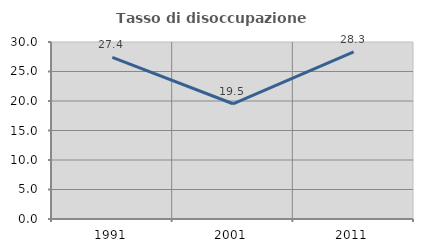
| Category | Tasso di disoccupazione giovanile  |
|---|---|
| 1991.0 | 27.392 |
| 2001.0 | 19.531 |
| 2011.0 | 28.313 |